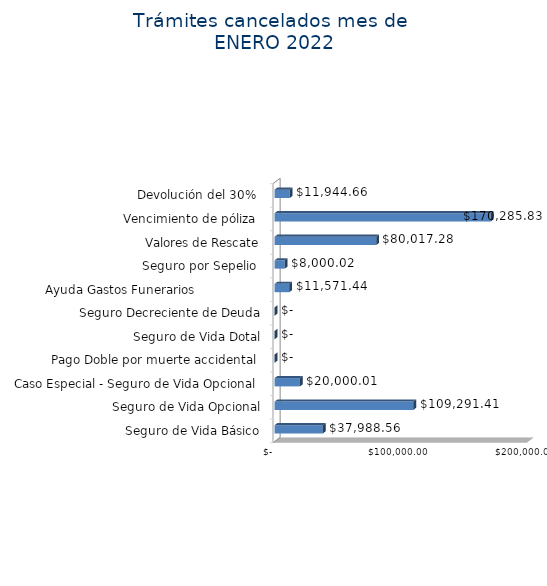
| Category | Monto  |
|---|---|
| Seguro de Vida Básico | 37988.56 |
| Seguro de Vida Opcional | 109291.41 |
| Caso Especial - Seguro de Vida Opcional  | 20000.01 |
| Pago Doble por muerte accidental  | 0 |
| Seguro de Vida Dotal | 0 |
| Seguro Decreciente de Deuda | 0 |
| Ayuda Gastos Funerarios                  | 11571.44 |
| Seguro por Sepelio  | 8000.02 |
| Valores de Rescate | 80017.28 |
| Vencimiento de póliza  | 170285.83 |
| Devolución del 30%  | 11944.66 |